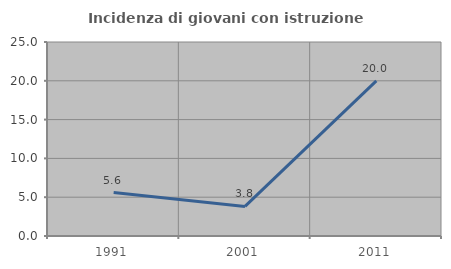
| Category | Incidenza di giovani con istruzione universitaria |
|---|---|
| 1991.0 | 5.6 |
| 2001.0 | 3.81 |
| 2011.0 | 20 |